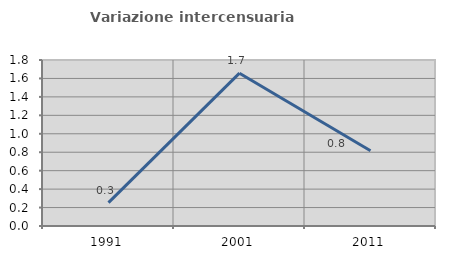
| Category | Variazione intercensuaria annua |
|---|---|
| 1991.0 | 0.253 |
| 2001.0 | 1.657 |
| 2011.0 | 0.816 |